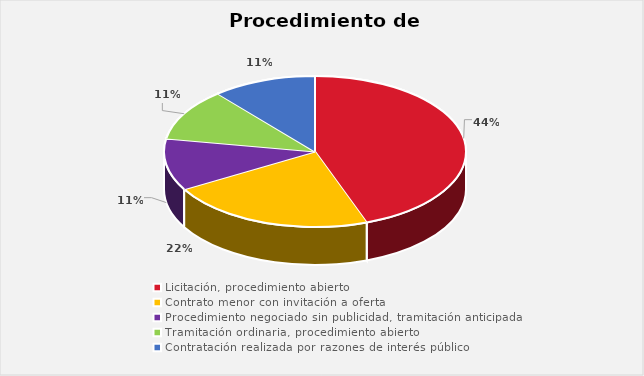
| Category | % sobre el total de contratos |
|---|---|
| Licitación, procedimiento abierto | 0.444 |
| Contrato menor con invitación a oferta | 0.222 |
| Procedimiento negociado sin publicidad, tramitación anticipada | 0.111 |
| Tramitación ordinaria, procedimiento abierto | 0.111 |
| Contratación realizada por razones de interés público | 0.111 |